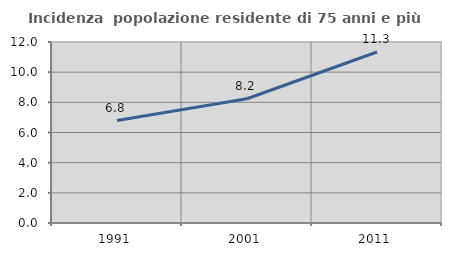
| Category | Incidenza  popolazione residente di 75 anni e più |
|---|---|
| 1991.0 | 6.792 |
| 2001.0 | 8.239 |
| 2011.0 | 11.338 |